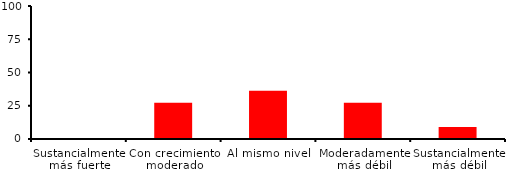
| Category | Series 0 |
|---|---|
| Sustancialmente más fuerte | 0 |
| Con crecimiento moderado | 27.273 |
| Al mismo nivel | 36.364 |
| Moderadamente más débil | 27.273 |
| Sustancialmente más débil | 9.091 |